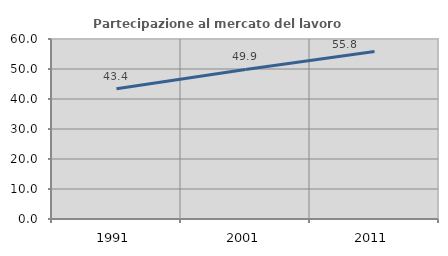
| Category | Partecipazione al mercato del lavoro  femminile |
|---|---|
| 1991.0 | 43.399 |
| 2001.0 | 49.855 |
| 2011.0 | 55.825 |